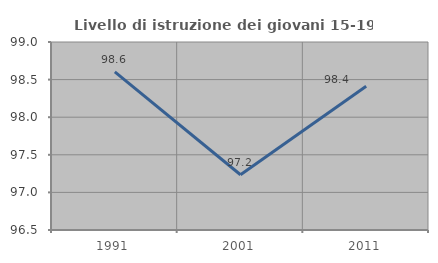
| Category | Livello di istruzione dei giovani 15-19 anni |
|---|---|
| 1991.0 | 98.603 |
| 2001.0 | 97.235 |
| 2011.0 | 98.413 |